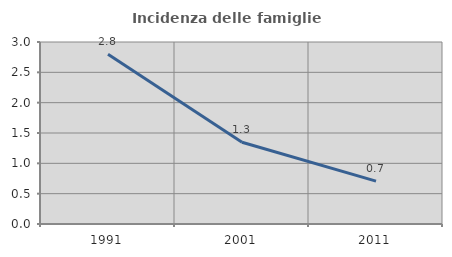
| Category | Incidenza delle famiglie numerose |
|---|---|
| 1991.0 | 2.799 |
| 2001.0 | 1.347 |
| 2011.0 | 0.706 |